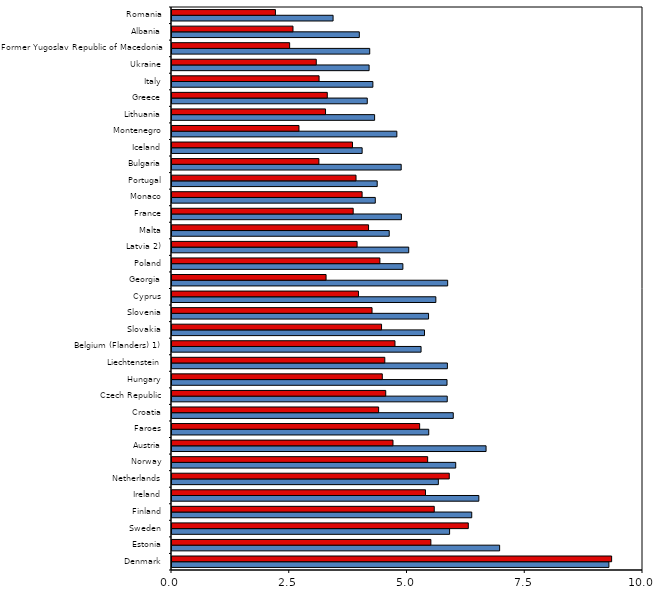
| Category | Boys | Girls |
|---|---|---|
| Denmark | 9.276 | 9.334 |
| Estonia | 6.956 | 5.496 |
| Sweden | 5.894 | 6.291 |
| Finland | 6.364 | 5.568 |
| Ireland | 6.515 | 5.382 |
| Netherlands | 5.655 | 5.887 |
| Norway | 6.024 | 5.428 |
| Austria | 6.668 | 4.692 |
| Faroes | 5.451 | 5.258 |
| Croatia | 5.972 | 4.387 |
| Czech Republic | 5.844 | 4.538 |
| Hungary | 5.839 | 4.465 |
| Liechtenstein | 5.847 | 4.518 |
| Belgium (Flanders) 1) | 5.288 | 4.734 |
| Slovakia | 5.361 | 4.449 |
| Slovenia | 5.447 | 4.247 |
| Cyprus | 5.602 | 3.959 |
| Georgia | 5.853 | 3.271 |
| Poland | 4.902 | 4.414 |
| Latvia 2) | 5.026 | 3.93 |
| Malta | 4.612 | 4.173 |
| France | 4.87 | 3.847 |
| Monaco | 4.316 | 4.036 |
| Portugal | 4.357 | 3.907 |
| Bulgaria | 4.866 | 3.119 |
| Iceland | 4.037 | 3.832 |
| Montenegro | 4.774 | 2.696 |
| Lithuania | 4.302 | 3.26 |
| Greece | 4.146 | 3.297 |
| Italy | 4.265 | 3.123 |
| Ukraine | 4.185 | 3.063 |
| Former Yugoslav Republic of Macedonia | 4.198 | 2.498 |
| Albania | 3.977 | 2.569 |
| Romania | 3.42 | 2.196 |